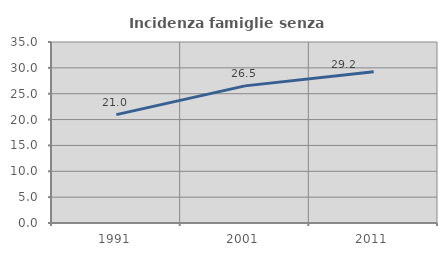
| Category | Incidenza famiglie senza nuclei |
|---|---|
| 1991.0 | 20.955 |
| 2001.0 | 26.515 |
| 2011.0 | 29.231 |